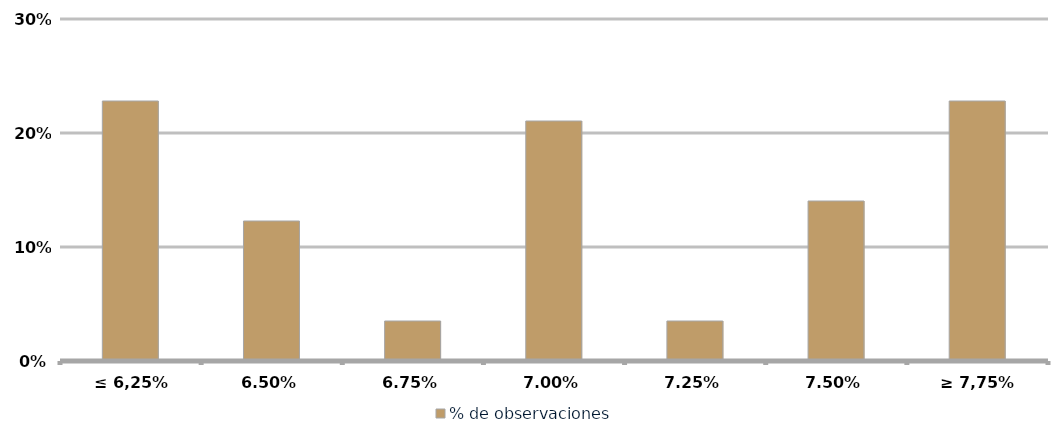
| Category | % de observaciones  |
|---|---|
| ≤ 6,25% | 0.228 |
| 6,50% | 0.123 |
| 6,75% | 0.035 |
| 7,00% | 0.211 |
| 7,25% | 0.035 |
| 7,50% | 0.14 |
| ≥ 7,75% | 0.228 |